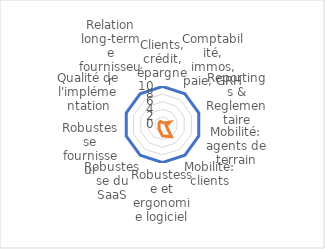
| Category | Ideal | Fournisseur #6 |
|---|---|---|
| Clients, crédit, épargne | 10 | 0.5 |
| Comptabilité, immos, paie, GRH | 10 | 0.5 |
| Reportings & Reglementaire | 10 | 2 |
| Mobilité: agents de terrain | 10 | 1 |
| Mobilité: clients | 10 | 4 |
| Robustesse et ergonomie logiciel | 10 | 3 |
| Robustesse du SaaS | 10 | 1.5 |
| Robustesse fournisseur | 10 | 1 |
| Qualité de l'implémentation | 10 | 1 |
| Relation long-terme fournisseur | 10 | 1 |